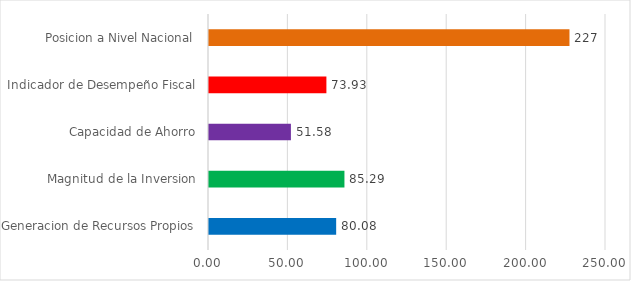
| Category | Series 0 |
|---|---|
| Generacion de Recursos Propios | 80.08 |
| Magnitud de la Inversion | 85.29 |
| Capacidad de Ahorro | 51.58 |
| Indicador de Desempeño Fiscal | 73.93 |
| Posicion a Nivel Nacional | 227 |